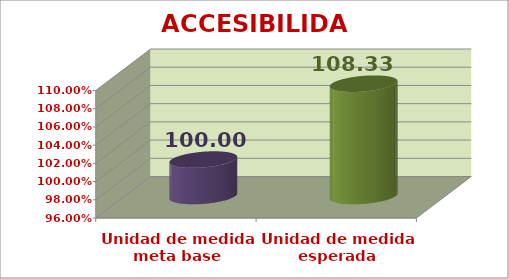
| Category | ACCESIBILIDAD |
|---|---|
| Unidad de medida meta base | 1 |
| Unidad de medida esperada | 1.083 |